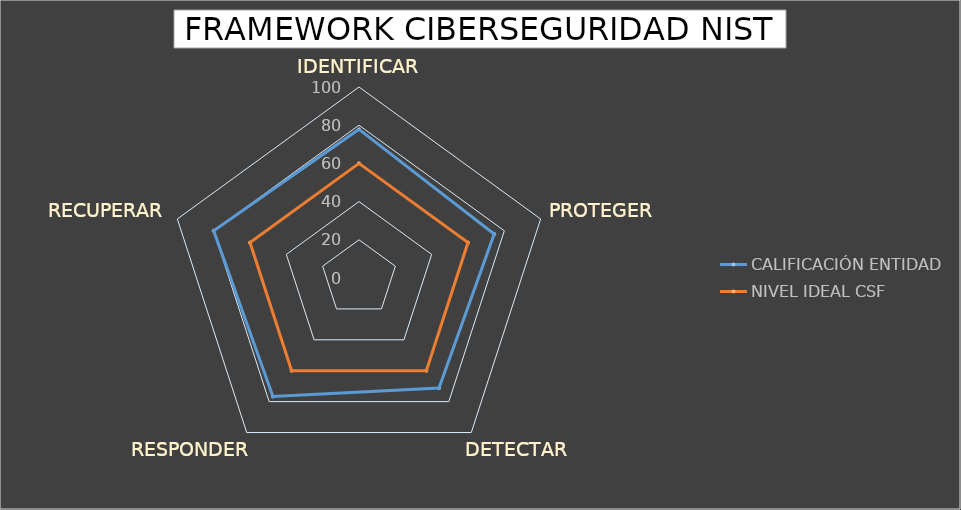
| Category | CALIFICACIÓN ENTIDAD | NIVEL IDEAL CSF |
|---|---|---|
| IDENTIFICAR | 77.833 | 60 |
| PROTEGER | 74.426 | 60 |
| DETECTAR | 71.25 | 60 |
| RESPONDER | 76.667 | 60 |
| RECUPERAR | 80 | 60 |